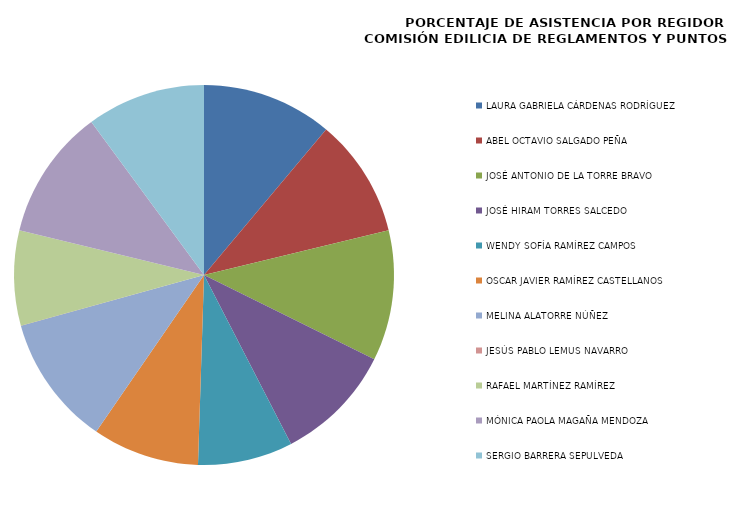
| Category | Series 0 |
|---|---|
| LAURA GABRIELA CÁRDENAS RODRÍGUEZ | 100 |
| ABEL OCTAVIO SALGADO PEÑA | 90.909 |
| JOSÉ ANTONIO DE LA TORRE BRAVO | 100 |
| JOSÉ HIRAM TORRES SALCEDO | 90.909 |
| WENDY SOFÍA RAMÍREZ CAMPOS | 72.727 |
| OSCAR JAVIER RAMÍREZ CASTELLANOS | 81.818 |
| MELINA ALATORRE NÚÑEZ | 100 |
| JESÚS PABLO LEMUS NAVARRO | 0 |
| RAFAEL MARTÍNEZ RAMÍREZ | 72.727 |
| MÓNICA PAOLA MAGAÑA MENDOZA | 100 |
| SERGIO BARRERA SEPULVEDA | 90.909 |